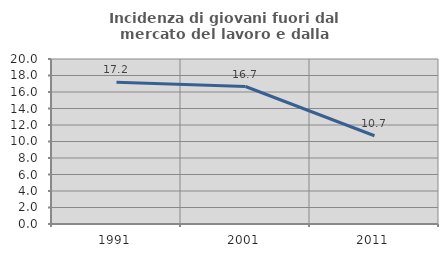
| Category | Incidenza di giovani fuori dal mercato del lavoro e dalla formazione  |
|---|---|
| 1991.0 | 17.181 |
| 2001.0 | 16.667 |
| 2011.0 | 10.698 |